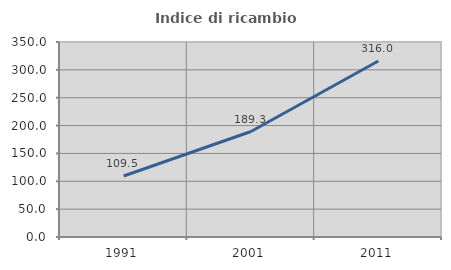
| Category | Indice di ricambio occupazionale  |
|---|---|
| 1991.0 | 109.524 |
| 2001.0 | 189.286 |
| 2011.0 | 316 |